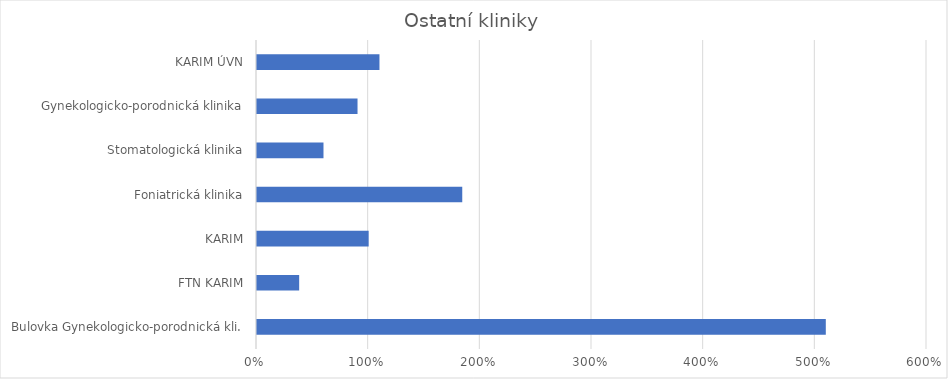
| Category | Series 0 |
|---|---|
| Bulovka Gynekologicko-porodnická kli. | 5.094 |
| FTN KARIM | 0.378 |
| KARIM | 1 |
| Foniatrická klinika | 1.838 |
| Stomatologická klinika | 0.595 |
| Gynekologicko-porodnická klinika | 0.9 |
| KARIM ÚVN | 1.097 |